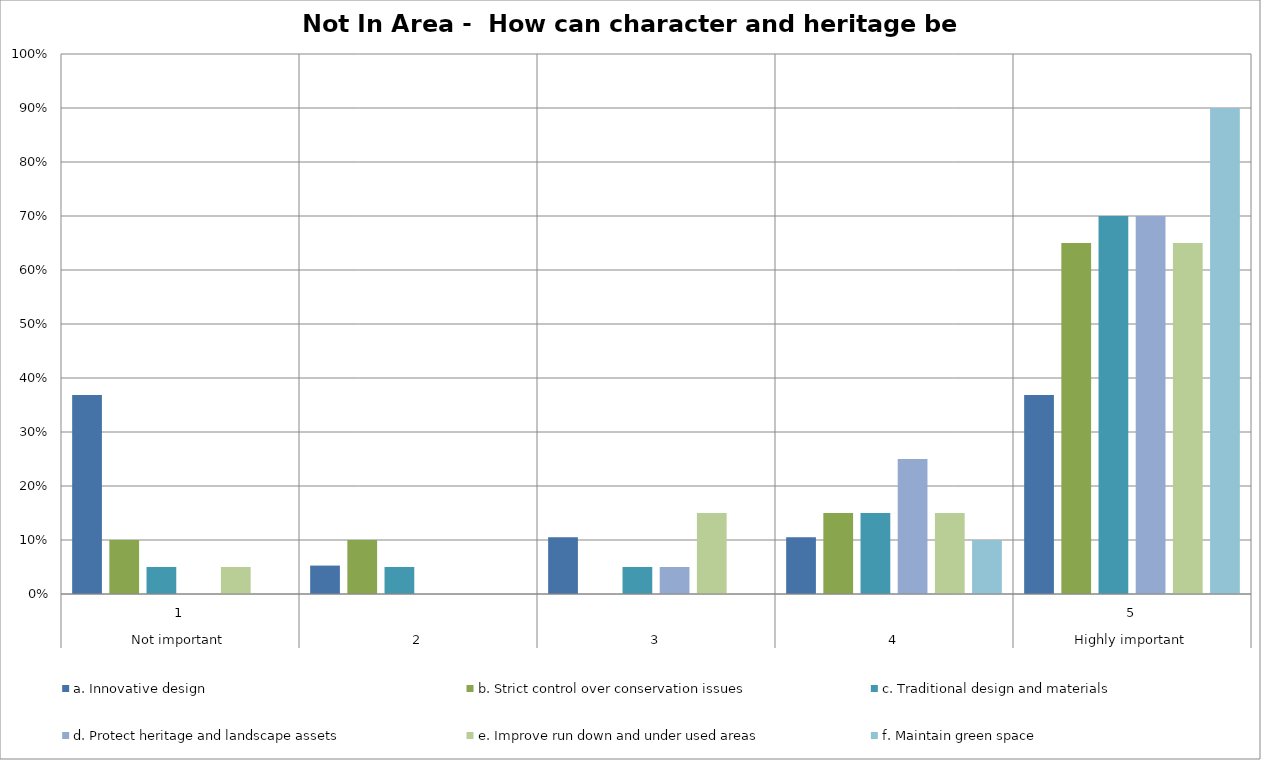
| Category | a. Innovative design | b. Strict control over conservation issues | c. Traditional design and materials | d. Protect heritage and landscape assets | e. Improve run down and under used areas | f. Maintain green space |
|---|---|---|---|---|---|---|
| 0 | 0.368 | 0.1 | 0.05 | 0 | 0.05 | 0 |
| 1 | 0.053 | 0.1 | 0.05 | 0 | 0 | 0 |
| 2 | 0.105 | 0 | 0.05 | 0.05 | 0.15 | 0 |
| 3 | 0.105 | 0.15 | 0.15 | 0.25 | 0.15 | 0.1 |
| 4 | 0.368 | 0.65 | 0.7 | 0.7 | 0.65 | 0.9 |